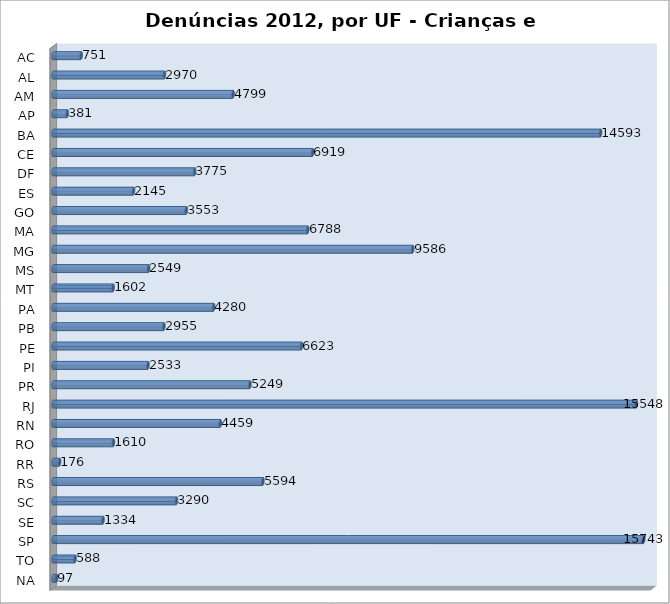
| Category | Series 0 |
|---|---|
| AC | 751 |
| AL | 2970 |
| AM | 4799 |
| AP | 381 |
| BA | 14593 |
| CE | 6919 |
| DF | 3775 |
| ES | 2145 |
| GO | 3553 |
| MA | 6788 |
| MG | 9586 |
| MS | 2549 |
| MT | 1602 |
| PA | 4280 |
| PB | 2955 |
| PE | 6623 |
| PI | 2533 |
| PR | 5249 |
| RJ | 15548 |
| RN | 4459 |
| RO | 1610 |
| RR | 176 |
| RS | 5594 |
| SC | 3290 |
| SE | 1334 |
| SP | 15743 |
| TO | 588 |
| NA | 97 |